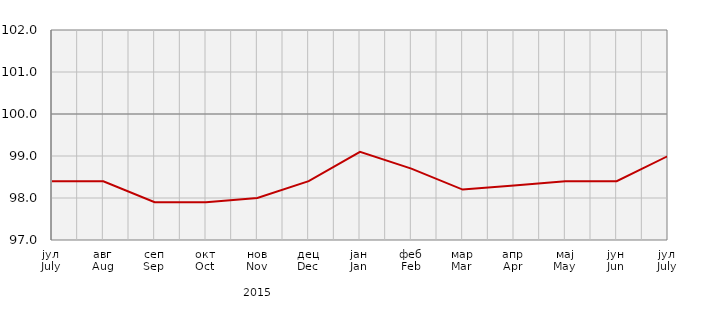
| Category | Индекси потрошачких цијена
Consumer price indices |
|---|---|
| јул
July | 98.4 |
| авг
Aug | 98.4 |
| сеп
Sep | 97.9 |
| окт
Oct | 97.9 |
| нов
Nov | 98 |
| дец
Dec | 98.4 |
| јан
Jan | 99.1 |
| феб
Feb | 98.7 |
| мар
Mar | 98.2 |
| апр
Apr | 98.3 |
| мај
May | 98.4 |
| јун
Jun | 98.4 |
| јул
July | 99 |